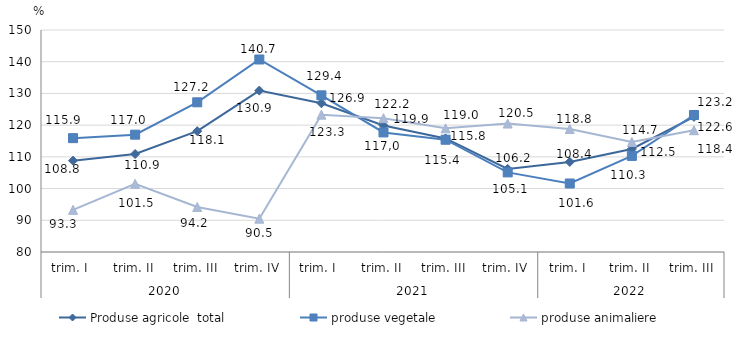
| Category | Produse agricole  total | produse vegetale | produse animaliere |
|---|---|---|---|
| 0 | 108.8 | 115.9 | 93.3 |
| 1 | 110.9 | 117 | 101.5 |
| 2 | 118.1 | 127.2 | 94.2 |
| 3 | 130.9 | 140.7 | 90.5 |
| 4 | 126.9 | 129.4 | 123.3 |
| 5 | 119.9 | 117.7 | 122.2 |
| 6 | 115.8 | 115.4 | 119 |
| 7 | 106.2 | 105.1 | 120.5 |
| 8 | 108.4 | 101.6 | 118.8 |
| 9 | 112.5 | 110.3 | 114.7 |
| 10 | 122.6 | 123.2 | 118.4 |